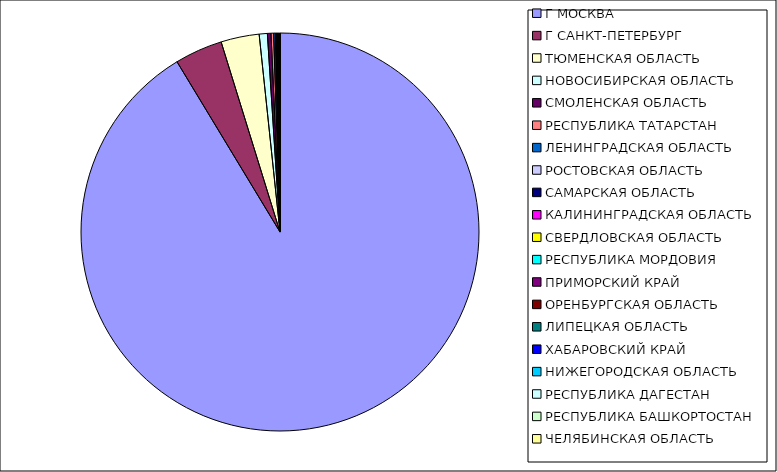
| Category | Оборот |
|---|---|
| Г МОСКВА | 0.913 |
| Г САНКТ-ПЕТЕРБУРГ | 0.039 |
| ТЮМЕНСКАЯ ОБЛАСТЬ | 0.031 |
| НОВОСИБИРСКАЯ ОБЛАСТЬ | 0.007 |
| СМОЛЕНСКАЯ ОБЛАСТЬ | 0.003 |
| РЕСПУБЛИКА ТАТАРСТАН | 0.002 |
| ЛЕНИНГРАДСКАЯ ОБЛАСТЬ | 0.001 |
| РОСТОВСКАЯ ОБЛАСТЬ | 0.001 |
| САМАРСКАЯ ОБЛАСТЬ | 0 |
| КАЛИНИНГРАДСКАЯ ОБЛАСТЬ | 0 |
| СВЕРДЛОВСКАЯ ОБЛАСТЬ | 0 |
| РЕСПУБЛИКА МОРДОВИЯ | 0 |
| ПРИМОРСКИЙ КРАЙ | 0 |
| ОРЕНБУРГСКАЯ ОБЛАСТЬ | 0 |
| ЛИПЕЦКАЯ ОБЛАСТЬ | 0 |
| ХАБАРОВСКИЙ КРАЙ | 0 |
| НИЖЕГОРОДСКАЯ ОБЛАСТЬ | 0 |
| РЕСПУБЛИКА ДАГЕСТАН | 0 |
| РЕСПУБЛИКА БАШКОРТОСТАН | 0 |
| ЧЕЛЯБИНСКАЯ ОБЛАСТЬ | 0 |
| КРАСНОДАРСКИЙ КРАЙ | 0 |
| ВОЛОГОДСКАЯ ОБЛАСТЬ | 0 |
| ИРКУТСКАЯ ОБЛАСТЬ | 0 |
| КАБАРДИНО-БАЛКАРСКАЯ РЕСПУБЛИКА | 0 |
| КИРОВСКАЯ ОБЛАСТЬ | 0 |